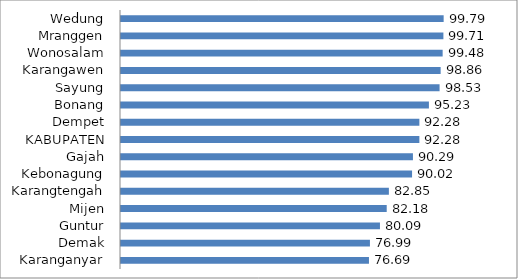
| Category | Series 0 |
|---|---|
| Karanganyar | 76.69 |
| Demak | 76.99 |
| Guntur | 80.09 |
| Mijen | 82.18 |
| Karangtengah | 82.85 |
| Kebonagung | 90.02 |
| Gajah | 90.29 |
| KABUPATEN | 92.28 |
| Dempet | 92.28 |
| Bonang | 95.23 |
| Sayung | 98.53 |
| Karangawen | 98.86 |
| Wonosalam | 99.48 |
| Mranggen | 99.71 |
| Wedung | 99.79 |